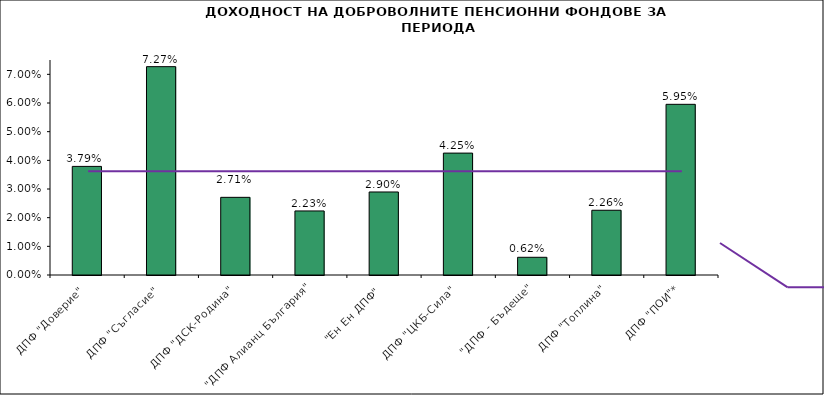
| Category | Series 0 |
|---|---|
| ДПФ "Доверие"  | 0.038 |
| ДПФ "Съгласие"  | 0.073 |
| ДПФ "ДСК-Родина"  | 0.027 |
| "ДПФ Алианц България"  | 0.022 |
| "Ен Ен ДПФ"  | 0.029 |
| ДПФ "ЦКБ-Сила"  | 0.043 |
| "ДПФ - Бъдеще" | 0.006 |
| ДПФ "Топлина" | 0.023 |
| ДПФ "ПОИ"* | 0.06 |